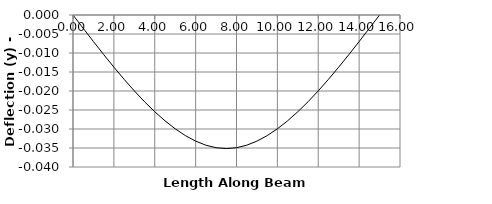
| Category | y |
|---|---|
| 0.0 | 0 |
| 0.5 | -0.004 |
| 1.0 | -0.007 |
| 1.5 | -0.01 |
| 2.0 | -0.014 |
| 2.5 | -0.017 |
| 3.0 | -0.02 |
| 3.5 | -0.023 |
| 4.0 | -0.025 |
| 4.5 | -0.028 |
| 5.0 | -0.03 |
| 5.5 | -0.032 |
| 6.0 | -0.033 |
| 6.5 | -0.034 |
| 7.0 | -0.035 |
| 7.5 | -0.035 |
| 7.50001 | -0.035 |
| 8.0 | -0.035 |
| 8.5 | -0.034 |
| 9.0 | -0.033 |
| 9.5 | -0.032 |
| 10.0 | -0.03 |
| 10.5 | -0.028 |
| 11.0 | -0.025 |
| 11.5 | -0.023 |
| 12.0 | -0.02 |
| 12.5 | -0.017 |
| 13.0 | -0.014 |
| 13.5 | -0.01 |
| 14.0 | -0.007 |
| 14.5 | -0.004 |
| 15.0 | 0 |